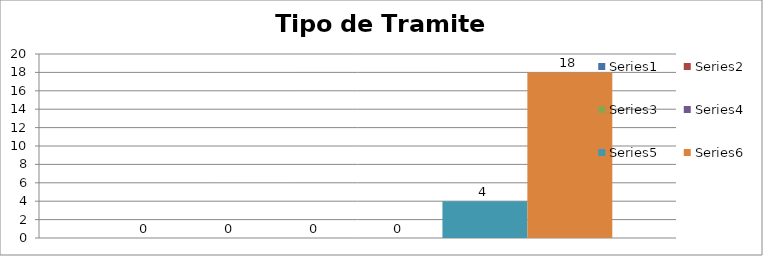
| Category | Series 0 | Series 1 | Series 2 | Series 3 | Series 4 | Series 5 |
|---|---|---|---|---|---|---|
| 0 | 0 | 0 | 0 | 0 | 4 | 18 |